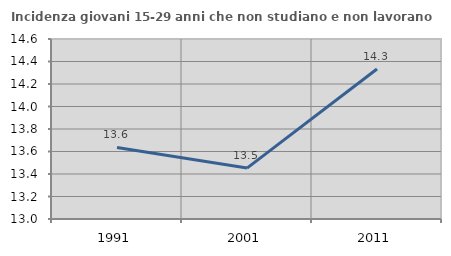
| Category | Incidenza giovani 15-29 anni che non studiano e non lavorano  |
|---|---|
| 1991.0 | 13.636 |
| 2001.0 | 13.452 |
| 2011.0 | 14.333 |